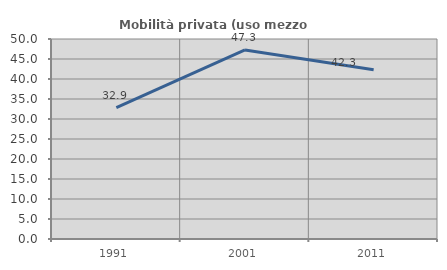
| Category | Mobilità privata (uso mezzo privato) |
|---|---|
| 1991.0 | 32.857 |
| 2001.0 | 47.273 |
| 2011.0 | 42.308 |